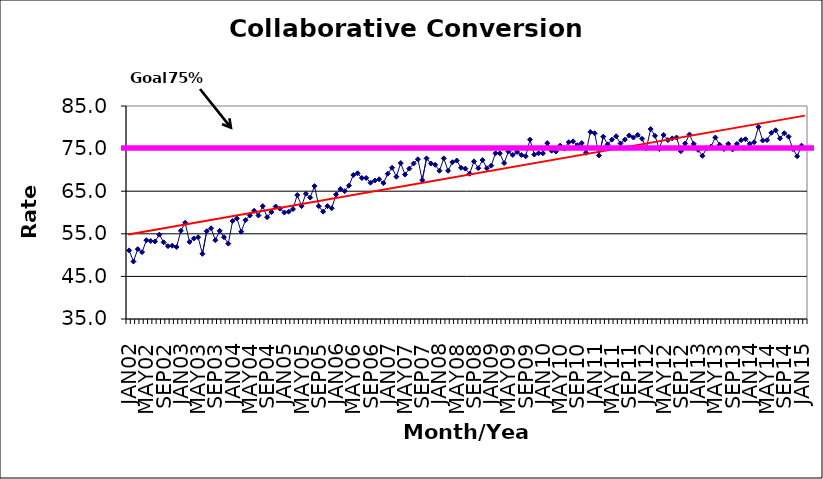
| Category | Series 0 |
|---|---|
| JAN02 | 51.1 |
| FEB02 | 48.5 |
| MAR02 | 51.4 |
| APR02 | 50.7 |
| MAY02 | 53.5 |
| JUN02 | 53.3 |
| JUL02 | 53.2 |
| AUG02 | 54.8 |
| SEP02 | 53 |
| OCT02 | 52.1 |
| NOV02 | 52.2 |
| DEC02 | 51.9 |
| JAN03 | 55.7 |
| FEB03 | 57.6 |
| MAR03 | 53.1 |
| APR03 | 53.9 |
| MAY03 | 54.2 |
| JUN03 | 50.3 |
| JUL03 | 55.6 |
| AUG03 | 56.3 |
| SEP03 | 53.5 |
| OCT03 | 55.7 |
| NOV03 | 54.2 |
| DEC03 | 52.7 |
| JAN04 | 58 |
| FEB04 | 58.6 |
| MAR04 | 55.5 |
| APR04 | 58.2 |
| MAY04 | 59.3 |
| JUN04 | 60.4 |
| JUL04 | 59.3 |
| AUG04 | 61.5 |
| SEP04 | 58.9 |
| OCT04 | 60.1 |
| NOV04 | 61.4 |
| DEC04 | 60.9 |
| JAN05 | 60 |
| FEB05 | 60.2 |
| MAR05 | 60.8 |
| APR05 | 64.1 |
| MAY05 | 61.5 |
| JUN05 | 64.4 |
| JUL05 | 63.5 |
| AUG05 | 66.2 |
| SEP05 | 61.5 |
| OCT05 | 60.2 |
| NOV05 | 61.5 |
| DEC05 | 61 |
| JAN06 | 64.2 |
| FEB06 | 65.5 |
| MAR06 | 65 |
| APR06 | 66.3 |
| MAY06 | 68.8 |
| JUN06 | 69.2 |
| JUL06 | 68.1 |
| AUG06 | 68.1 |
| SEP06 | 67 |
| OCT06 | 67.5 |
| NOV06 | 67.8 |
| DEC06 | 66.9 |
| JAN07 | 69.1 |
| FEB07 | 70.5 |
| MAR07 | 68.4 |
| APR07 | 71.6 |
| MAY07 | 68.9 |
| JUN07 | 70.3 |
| JUL07 | 71.5 |
| AUG07 | 72.5 |
| SEP07 | 67.6 |
| OCT07 | 72.7 |
| NOV07 | 71.5 |
| DEC07 | 71.2 |
| JAN08 | 69.8 |
| FEB08 | 72.7 |
| MAR08 | 69.8 |
| APR08 | 71.8 |
| MAY08 | 72.2 |
| JUN08 | 70.5 |
| JUL08 | 70.3 |
| AUG08 | 69.1 |
| SEP08 | 72 |
| OCT08 | 70.4 |
| NOV08 | 72.3 |
| DEC08 | 70.4 |
| JAN09 | 71 |
| FEB09 | 73.9 |
| MAR09 | 73.9 |
| APR09 | 71.6 |
| MAY09 | 74.3 |
| JUN09 | 73.5 |
| JUL09 | 74.2 |
| AUG09 | 73.5 |
| SEP09 | 73.2 |
| OCT09 | 77.1 |
| NOV09 | 73.6 |
| DEC09 | 73.9 |
| JAN10 | 73.9 |
| FEB10 | 76.3 |
| MAR10 | 74.5 |
| APR10 | 74.3 |
| MAY10 | 75.7 |
| JUN10 | 75 |
| JUL10 | 76.5 |
| AUG10 | 76.7 |
| SEP10 | 75.8 |
| OCT10 | 76.3 |
| NOV10 | 74 |
| DEC10 | 78.9 |
| JAN11 | 78.6 |
| FEB11 | 73.4 |
| MAR11 | 77.8 |
| APR11 | 76 |
| MAY11 | 77.1 |
| JUN11 | 77.9 |
| JUL11 | 76.2 |
| AUG11 | 77.1 |
| SEP11 | 78.1 |
| OCT11 | 77.6 |
| NOV11 | 78.2 |
| DEC11 | 77.3 |
| JAN12 | 75.1 |
| FEB12 | 79.6 |
| MAR12 | 78 |
| APR12 | 74.9 |
| MAY12 | 78.2 |
| JUN12 | 77 |
| JUL12 | 77.4 |
| AUG12 | 77.6 |
| SEP12 | 74.4 |
| OCT12 | 76.2 |
| NOV12 | 78.3 |
| DEC12 | 76.1 |
| JAN13 | 74.7 |
| FEB13 | 73.3 |
| MAR13 | 75.1 |
| APR13 | 75.5 |
| MAY13 | 77.6 |
| JUN13 | 75.9 |
| JUL13 | 74.9 |
| AUG13 | 76.1 |
| SEP13 | 74.8 |
| OCT13 | 76.1 |
| NOV13 | 77 |
| DEC13 | 77.2 |
| JAN14 | 76.1 |
| FEB14 | 76.5 |
| MAR14 | 80.1 |
| APR14 | 76.9 |
| MAY14 | 77 |
| JUN14 | 78.7 |
| JUL14 | 79.3 |
| AUG14 | 77.4 |
| SEP14 | 78.6 |
| OCT14 | 77.8 |
| NOV14 | 74.9 |
| DEC14 | 73.2 |
| JAN15 | 75.7 |